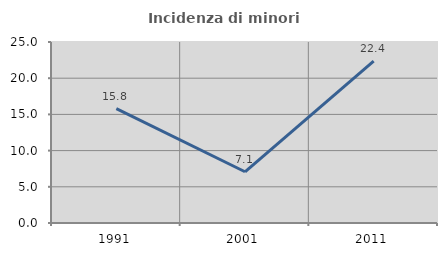
| Category | Incidenza di minori stranieri |
|---|---|
| 1991.0 | 15.789 |
| 2001.0 | 7.075 |
| 2011.0 | 22.353 |